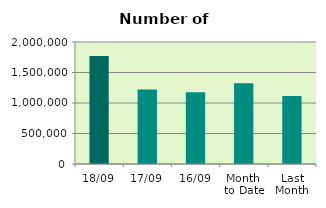
| Category | Series 0 |
|---|---|
| 18/09 | 1771224 |
| 17/09 | 1222032 |
| 16/09 | 1174690 |
| Month 
to Date | 1324223.286 |
| Last
Month | 1113186.286 |